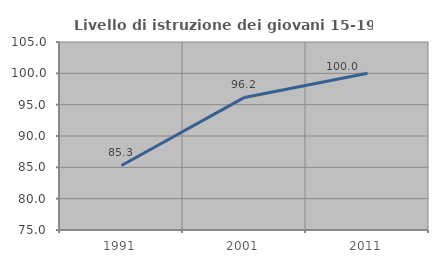
| Category | Livello di istruzione dei giovani 15-19 anni |
|---|---|
| 1991.0 | 85.294 |
| 2001.0 | 96.154 |
| 2011.0 | 100 |